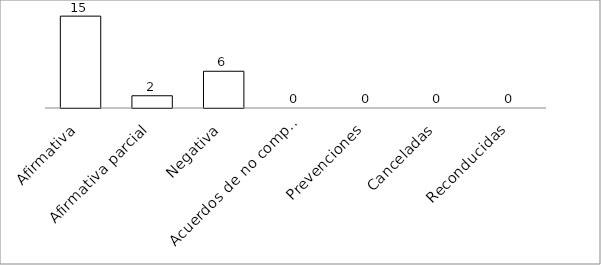
| Category | Series 0 |
|---|---|
| Afirmativa | 15 |
| Afirmativa parcial | 2 |
| Negativa | 6 |
| Acuerdos de no competencia | 0 |
| Prevenciones | 0 |
| Canceladas | 0 |
| Reconducidas | 0 |